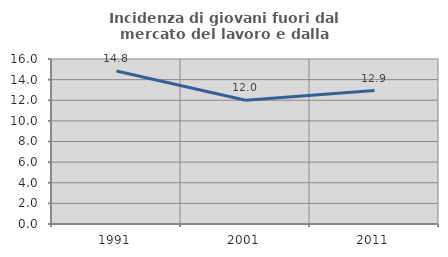
| Category | Incidenza di giovani fuori dal mercato del lavoro e dalla formazione  |
|---|---|
| 1991.0 | 14.839 |
| 2001.0 | 12 |
| 2011.0 | 12.941 |